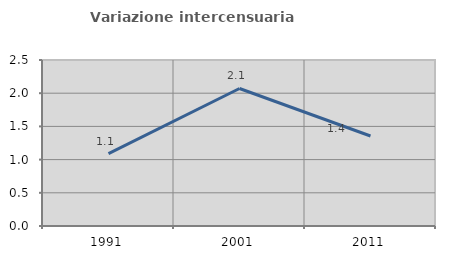
| Category | Variazione intercensuaria annua |
|---|---|
| 1991.0 | 1.089 |
| 2001.0 | 2.071 |
| 2011.0 | 1.356 |